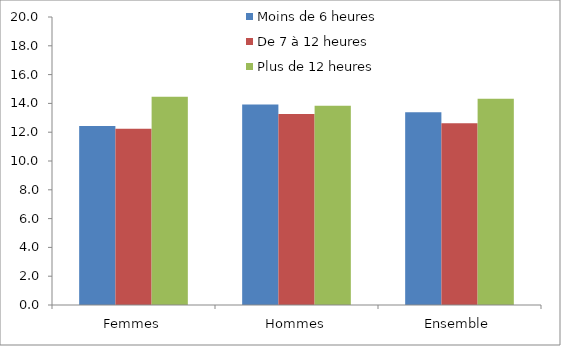
| Category | Moins de 6 heures | De 7 à 12 heures | Plus de 12 heures |
|---|---|---|---|
| Femmes | 12.43 | 12.24 | 14.46 |
| Hommes | 13.93 | 13.26 | 13.84 |
| Ensemble | 13.38 | 12.63 | 14.32 |